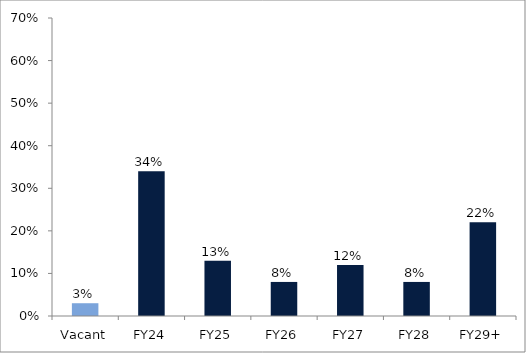
| Category | Series 0 |
|---|---|
| Vacant | 0.03 |
| FY24 | 0.34 |
| FY25 | 0.13 |
| FY26 | 0.08 |
| FY27 | 0.12 |
| FY28 | 0.08 |
| FY29+ | 0.22 |